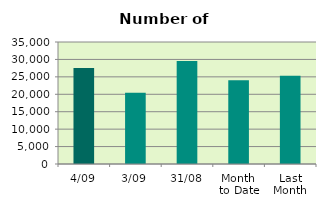
| Category | Series 0 |
|---|---|
| 4/09 | 27574 |
| 3/09 | 20464 |
| 31/08 | 29558 |
| Month 
to Date | 24019 |
| Last
Month | 25327.391 |